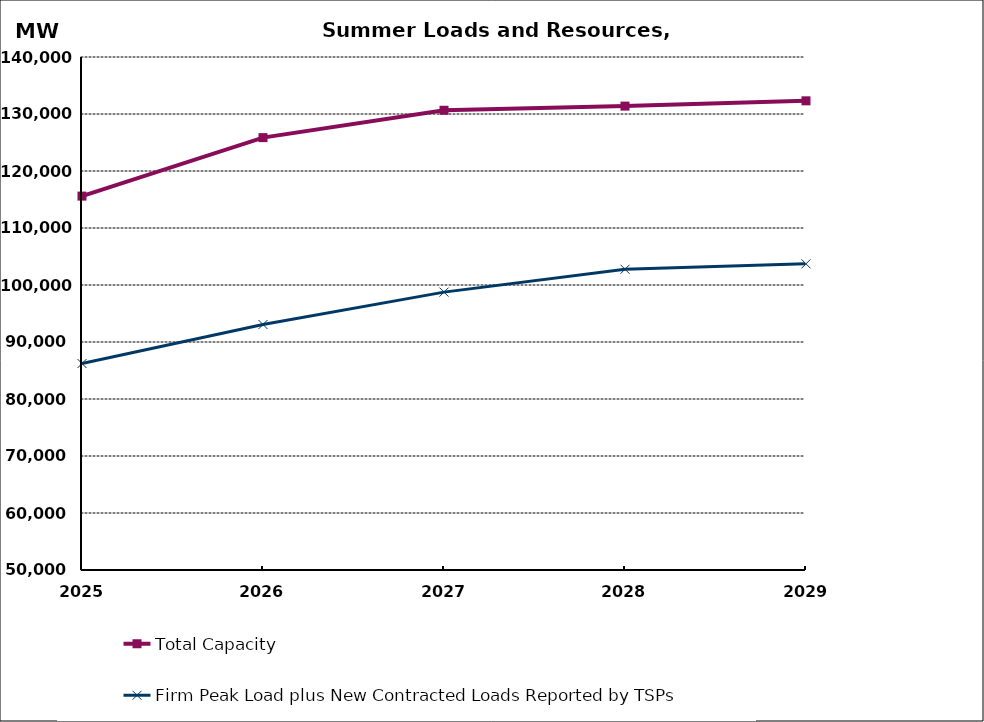
| Category | Total Capacity | Firm Peak Load plus New Contracted Loads Reported by TSPs |
|---|---|---|
| 2025.0 | 115595.777 | 86220.837 |
| 2026.0 | 125854.354 | 93068.512 |
| 2027.0 | 130655.852 | 98752.504 |
| 2028.0 | 131384.6 | 102764.67 |
| 2029.0 | 132312.064 | 103713.27 |